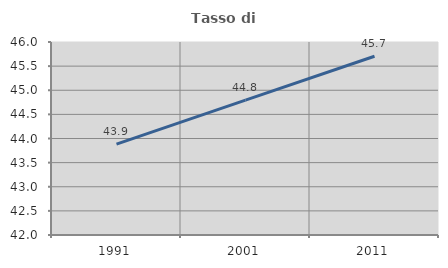
| Category | Tasso di occupazione   |
|---|---|
| 1991.0 | 43.885 |
| 2001.0 | 44.795 |
| 2011.0 | 45.705 |